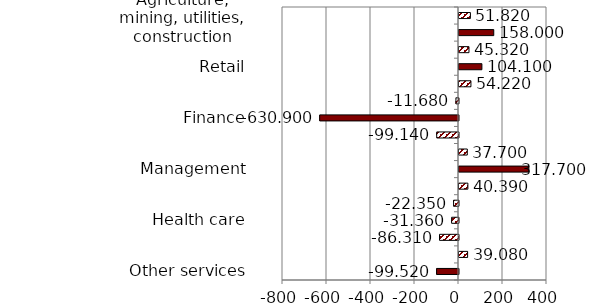
| Category | Series 0 |
|---|---|
| Other services | -99.52 |
| Accommodation | 39.08 |
| Arts | -86.31 |
| Health care | -31.36 |
| Educational | -22.35 |
| Administrative | 40.39 |
| Management | 317.7 |
| Professional | 37.7 |
| Real estate | -99.14 |
| Finance | -630.9 |
| Information | -11.68 |
| Transportation | 54.22 |
| Retail | 104.1 |
| Wholesale | 45.32 |
| Manufacturing | 158 |
| Agriculture, mining, utilities, construction | 51.82 |